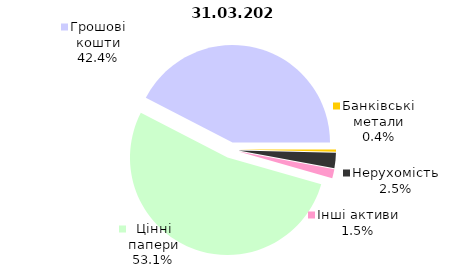
| Category | 31.03.2023 |
|---|---|
| Цінні папери | 2277.484 |
| Грошові кошти | 1818.783 |
| Банківські метали | 16.052 |
| Нерухомість | 108.949 |
| Інші активи | 65.442 |